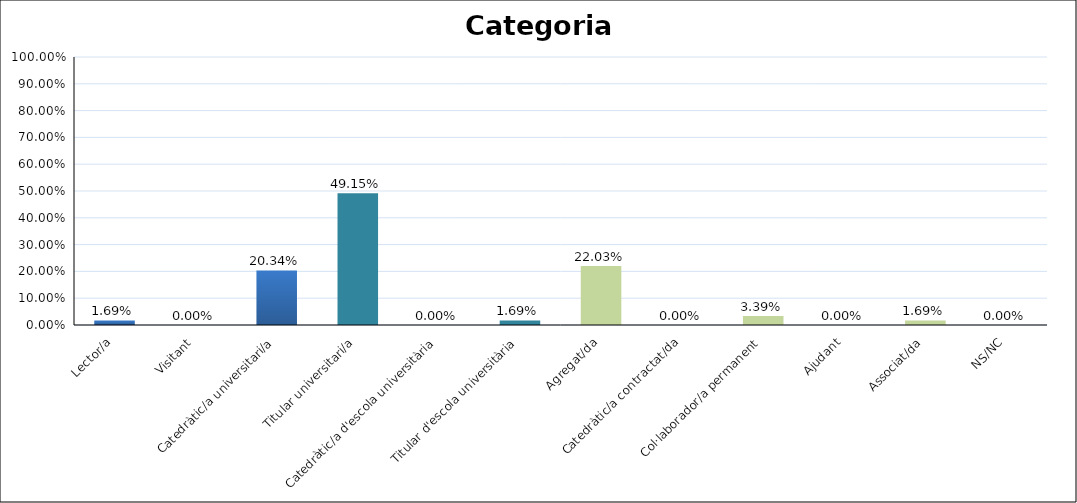
| Category | Series 0 |
|---|---|
| Lector/a | 0.017 |
| Visitant | 0 |
| Catedràtic/a universitari/a | 0.203 |
| Titular universitari/a | 0.492 |
| Catedràtic/a d'escola universitària | 0 |
| Titular d'escola universitària | 0.017 |
| Agregat/da | 0.22 |
| Catedràtic/a contractat/da | 0 |
| Col·laborador/a permanent | 0.034 |
| Ajudant | 0 |
| Associat/da | 0.017 |
| NS/NC | 0 |